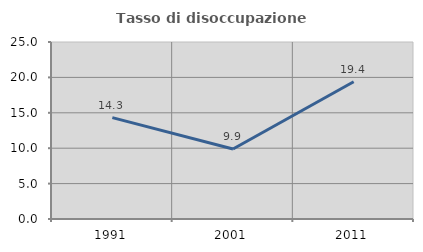
| Category | Tasso di disoccupazione giovanile  |
|---|---|
| 1991.0 | 14.322 |
| 2001.0 | 9.884 |
| 2011.0 | 19.385 |